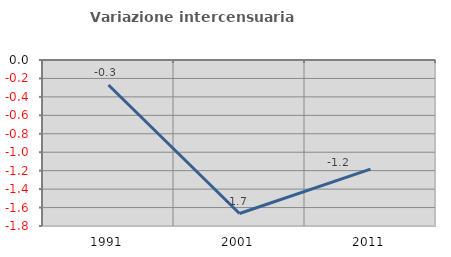
| Category | Variazione intercensuaria annua |
|---|---|
| 1991.0 | -0.271 |
| 2001.0 | -1.665 |
| 2011.0 | -1.184 |